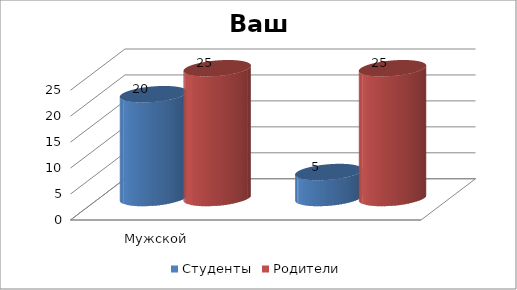
| Category | Студенты | Родители |
|---|---|---|
| Мужской | 20 | 25 |